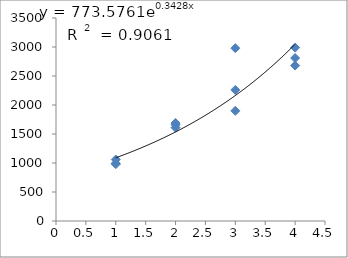
| Category | Series 0 |
|---|---|
| 1.0 | 1060 |
| 1.0 | 980 |
| 1.0 | 995 |
| 2.0 | 1690 |
| 2.0 | 1660 |
| 2.0 | 1610 |
| 3.0 | 2260 |
| 3.0 | 1900 |
| 3.0 | 2980 |
| 4.0 | 2680 |
| 4.0 | 2990 |
| 4.0 | 2810 |